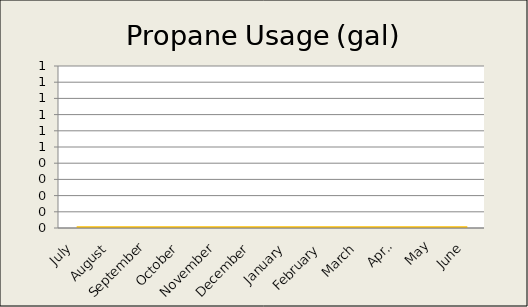
| Category | Series 1 | Propane Usage (gal) |
|---|---|---|
| 0 | 0 | 0 |
| 1 | 0 | 0 |
| 2 | 0 | 0 |
| 3 | 0 | 0 |
| 4 | 0 | 0 |
| 5 | 0 | 0 |
| 6 | 0 | 0 |
| 7 | 0 | 0 |
| 8 | 0 | 0 |
| 9 | 0 | 0 |
| 10 | 0 | 0 |
| 11 | 0 | 0 |